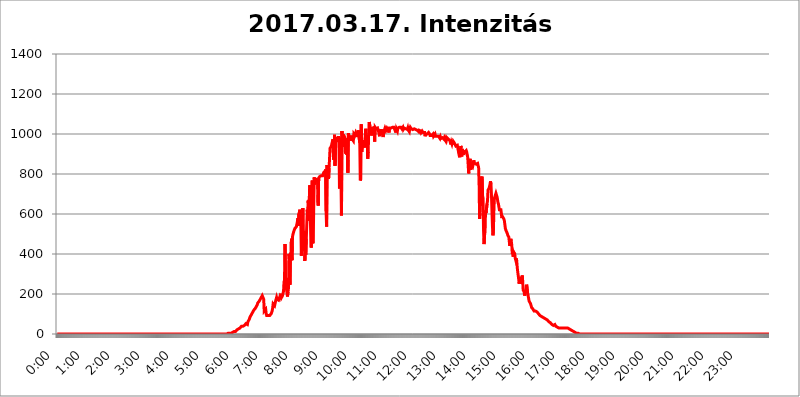
| Category | 2017.03.17. Intenzitás [W/m^2] |
|---|---|
| 0.0 | 0 |
| 0.0006944444444444445 | 0 |
| 0.001388888888888889 | 0 |
| 0.0020833333333333333 | 0 |
| 0.002777777777777778 | 0 |
| 0.003472222222222222 | 0 |
| 0.004166666666666667 | 0 |
| 0.004861111111111111 | 0 |
| 0.005555555555555556 | 0 |
| 0.0062499999999999995 | 0 |
| 0.006944444444444444 | 0 |
| 0.007638888888888889 | 0 |
| 0.008333333333333333 | 0 |
| 0.009027777777777779 | 0 |
| 0.009722222222222222 | 0 |
| 0.010416666666666666 | 0 |
| 0.011111111111111112 | 0 |
| 0.011805555555555555 | 0 |
| 0.012499999999999999 | 0 |
| 0.013194444444444444 | 0 |
| 0.013888888888888888 | 0 |
| 0.014583333333333332 | 0 |
| 0.015277777777777777 | 0 |
| 0.015972222222222224 | 0 |
| 0.016666666666666666 | 0 |
| 0.017361111111111112 | 0 |
| 0.018055555555555557 | 0 |
| 0.01875 | 0 |
| 0.019444444444444445 | 0 |
| 0.02013888888888889 | 0 |
| 0.020833333333333332 | 0 |
| 0.02152777777777778 | 0 |
| 0.022222222222222223 | 0 |
| 0.02291666666666667 | 0 |
| 0.02361111111111111 | 0 |
| 0.024305555555555556 | 0 |
| 0.024999999999999998 | 0 |
| 0.025694444444444447 | 0 |
| 0.02638888888888889 | 0 |
| 0.027083333333333334 | 0 |
| 0.027777777777777776 | 0 |
| 0.02847222222222222 | 0 |
| 0.029166666666666664 | 0 |
| 0.029861111111111113 | 0 |
| 0.030555555555555555 | 0 |
| 0.03125 | 0 |
| 0.03194444444444445 | 0 |
| 0.03263888888888889 | 0 |
| 0.03333333333333333 | 0 |
| 0.034027777777777775 | 0 |
| 0.034722222222222224 | 0 |
| 0.035416666666666666 | 0 |
| 0.036111111111111115 | 0 |
| 0.03680555555555556 | 0 |
| 0.0375 | 0 |
| 0.03819444444444444 | 0 |
| 0.03888888888888889 | 0 |
| 0.03958333333333333 | 0 |
| 0.04027777777777778 | 0 |
| 0.04097222222222222 | 0 |
| 0.041666666666666664 | 0 |
| 0.042361111111111106 | 0 |
| 0.04305555555555556 | 0 |
| 0.043750000000000004 | 0 |
| 0.044444444444444446 | 0 |
| 0.04513888888888889 | 0 |
| 0.04583333333333334 | 0 |
| 0.04652777777777778 | 0 |
| 0.04722222222222222 | 0 |
| 0.04791666666666666 | 0 |
| 0.04861111111111111 | 0 |
| 0.049305555555555554 | 0 |
| 0.049999999999999996 | 0 |
| 0.05069444444444445 | 0 |
| 0.051388888888888894 | 0 |
| 0.052083333333333336 | 0 |
| 0.05277777777777778 | 0 |
| 0.05347222222222222 | 0 |
| 0.05416666666666667 | 0 |
| 0.05486111111111111 | 0 |
| 0.05555555555555555 | 0 |
| 0.05625 | 0 |
| 0.05694444444444444 | 0 |
| 0.057638888888888885 | 0 |
| 0.05833333333333333 | 0 |
| 0.05902777777777778 | 0 |
| 0.059722222222222225 | 0 |
| 0.06041666666666667 | 0 |
| 0.061111111111111116 | 0 |
| 0.06180555555555556 | 0 |
| 0.0625 | 0 |
| 0.06319444444444444 | 0 |
| 0.06388888888888888 | 0 |
| 0.06458333333333334 | 0 |
| 0.06527777777777778 | 0 |
| 0.06597222222222222 | 0 |
| 0.06666666666666667 | 0 |
| 0.06736111111111111 | 0 |
| 0.06805555555555555 | 0 |
| 0.06874999999999999 | 0 |
| 0.06944444444444443 | 0 |
| 0.07013888888888889 | 0 |
| 0.07083333333333333 | 0 |
| 0.07152777777777779 | 0 |
| 0.07222222222222223 | 0 |
| 0.07291666666666667 | 0 |
| 0.07361111111111111 | 0 |
| 0.07430555555555556 | 0 |
| 0.075 | 0 |
| 0.07569444444444444 | 0 |
| 0.0763888888888889 | 0 |
| 0.07708333333333334 | 0 |
| 0.07777777777777778 | 0 |
| 0.07847222222222222 | 0 |
| 0.07916666666666666 | 0 |
| 0.0798611111111111 | 0 |
| 0.08055555555555556 | 0 |
| 0.08125 | 0 |
| 0.08194444444444444 | 0 |
| 0.08263888888888889 | 0 |
| 0.08333333333333333 | 0 |
| 0.08402777777777777 | 0 |
| 0.08472222222222221 | 0 |
| 0.08541666666666665 | 0 |
| 0.08611111111111112 | 0 |
| 0.08680555555555557 | 0 |
| 0.08750000000000001 | 0 |
| 0.08819444444444445 | 0 |
| 0.08888888888888889 | 0 |
| 0.08958333333333333 | 0 |
| 0.09027777777777778 | 0 |
| 0.09097222222222222 | 0 |
| 0.09166666666666667 | 0 |
| 0.09236111111111112 | 0 |
| 0.09305555555555556 | 0 |
| 0.09375 | 0 |
| 0.09444444444444444 | 0 |
| 0.09513888888888888 | 0 |
| 0.09583333333333333 | 0 |
| 0.09652777777777777 | 0 |
| 0.09722222222222222 | 0 |
| 0.09791666666666667 | 0 |
| 0.09861111111111111 | 0 |
| 0.09930555555555555 | 0 |
| 0.09999999999999999 | 0 |
| 0.10069444444444443 | 0 |
| 0.1013888888888889 | 0 |
| 0.10208333333333335 | 0 |
| 0.10277777777777779 | 0 |
| 0.10347222222222223 | 0 |
| 0.10416666666666667 | 0 |
| 0.10486111111111111 | 0 |
| 0.10555555555555556 | 0 |
| 0.10625 | 0 |
| 0.10694444444444444 | 0 |
| 0.1076388888888889 | 0 |
| 0.10833333333333334 | 0 |
| 0.10902777777777778 | 0 |
| 0.10972222222222222 | 0 |
| 0.1111111111111111 | 0 |
| 0.11180555555555556 | 0 |
| 0.11180555555555556 | 0 |
| 0.1125 | 0 |
| 0.11319444444444444 | 0 |
| 0.11388888888888889 | 0 |
| 0.11458333333333333 | 0 |
| 0.11527777777777777 | 0 |
| 0.11597222222222221 | 0 |
| 0.11666666666666665 | 0 |
| 0.1173611111111111 | 0 |
| 0.11805555555555557 | 0 |
| 0.11944444444444445 | 0 |
| 0.12013888888888889 | 0 |
| 0.12083333333333333 | 0 |
| 0.12152777777777778 | 0 |
| 0.12222222222222223 | 0 |
| 0.12291666666666667 | 0 |
| 0.12291666666666667 | 0 |
| 0.12361111111111112 | 0 |
| 0.12430555555555556 | 0 |
| 0.125 | 0 |
| 0.12569444444444444 | 0 |
| 0.12638888888888888 | 0 |
| 0.12708333333333333 | 0 |
| 0.16875 | 0 |
| 0.12847222222222224 | 0 |
| 0.12916666666666668 | 0 |
| 0.12986111111111112 | 0 |
| 0.13055555555555556 | 0 |
| 0.13125 | 0 |
| 0.13194444444444445 | 0 |
| 0.1326388888888889 | 0 |
| 0.13333333333333333 | 0 |
| 0.13402777777777777 | 0 |
| 0.13402777777777777 | 0 |
| 0.13472222222222222 | 0 |
| 0.13541666666666666 | 0 |
| 0.1361111111111111 | 0 |
| 0.13749999999999998 | 0 |
| 0.13819444444444443 | 0 |
| 0.1388888888888889 | 0 |
| 0.13958333333333334 | 0 |
| 0.14027777777777778 | 0 |
| 0.14097222222222222 | 0 |
| 0.14166666666666666 | 0 |
| 0.1423611111111111 | 0 |
| 0.14305555555555557 | 0 |
| 0.14375000000000002 | 0 |
| 0.14444444444444446 | 0 |
| 0.1451388888888889 | 0 |
| 0.1451388888888889 | 0 |
| 0.14652777777777778 | 0 |
| 0.14722222222222223 | 0 |
| 0.14791666666666667 | 0 |
| 0.1486111111111111 | 0 |
| 0.14930555555555555 | 0 |
| 0.15 | 0 |
| 0.15069444444444444 | 0 |
| 0.15138888888888888 | 0 |
| 0.15208333333333332 | 0 |
| 0.15277777777777776 | 0 |
| 0.15347222222222223 | 0 |
| 0.15416666666666667 | 0 |
| 0.15486111111111112 | 0 |
| 0.15555555555555556 | 0 |
| 0.15625 | 0 |
| 0.15694444444444444 | 0 |
| 0.15763888888888888 | 0 |
| 0.15833333333333333 | 0 |
| 0.15902777777777777 | 0 |
| 0.15972222222222224 | 0 |
| 0.16041666666666668 | 0 |
| 0.16111111111111112 | 0 |
| 0.16180555555555556 | 0 |
| 0.1625 | 0 |
| 0.16319444444444445 | 0 |
| 0.1638888888888889 | 0 |
| 0.16458333333333333 | 0 |
| 0.16527777777777777 | 0 |
| 0.16597222222222222 | 0 |
| 0.16666666666666666 | 0 |
| 0.1673611111111111 | 0 |
| 0.16805555555555554 | 0 |
| 0.16874999999999998 | 0 |
| 0.16944444444444443 | 0 |
| 0.17013888888888887 | 0 |
| 0.1708333333333333 | 0 |
| 0.17152777777777775 | 0 |
| 0.17222222222222225 | 0 |
| 0.1729166666666667 | 0 |
| 0.17361111111111113 | 0 |
| 0.17430555555555557 | 0 |
| 0.17500000000000002 | 0 |
| 0.17569444444444446 | 0 |
| 0.1763888888888889 | 0 |
| 0.17708333333333334 | 0 |
| 0.17777777777777778 | 0 |
| 0.17847222222222223 | 0 |
| 0.17916666666666667 | 0 |
| 0.1798611111111111 | 0 |
| 0.18055555555555555 | 0 |
| 0.18125 | 0 |
| 0.18194444444444444 | 0 |
| 0.1826388888888889 | 0 |
| 0.18333333333333335 | 0 |
| 0.1840277777777778 | 0 |
| 0.18472222222222223 | 0 |
| 0.18541666666666667 | 0 |
| 0.18611111111111112 | 0 |
| 0.18680555555555556 | 0 |
| 0.1875 | 0 |
| 0.18819444444444444 | 0 |
| 0.18888888888888888 | 0 |
| 0.18958333333333333 | 0 |
| 0.19027777777777777 | 0 |
| 0.1909722222222222 | 0 |
| 0.19166666666666665 | 0 |
| 0.19236111111111112 | 0 |
| 0.19305555555555554 | 0 |
| 0.19375 | 0 |
| 0.19444444444444445 | 0 |
| 0.1951388888888889 | 0 |
| 0.19583333333333333 | 0 |
| 0.19652777777777777 | 0 |
| 0.19722222222222222 | 0 |
| 0.19791666666666666 | 0 |
| 0.1986111111111111 | 0 |
| 0.19930555555555554 | 0 |
| 0.19999999999999998 | 0 |
| 0.20069444444444443 | 0 |
| 0.20138888888888887 | 0 |
| 0.2020833333333333 | 0 |
| 0.2027777777777778 | 0 |
| 0.2034722222222222 | 0 |
| 0.2041666666666667 | 0 |
| 0.20486111111111113 | 0 |
| 0.20555555555555557 | 0 |
| 0.20625000000000002 | 0 |
| 0.20694444444444446 | 0 |
| 0.2076388888888889 | 0 |
| 0.20833333333333334 | 0 |
| 0.20902777777777778 | 0 |
| 0.20972222222222223 | 0 |
| 0.21041666666666667 | 0 |
| 0.2111111111111111 | 0 |
| 0.21180555555555555 | 0 |
| 0.2125 | 0 |
| 0.21319444444444444 | 0 |
| 0.2138888888888889 | 0 |
| 0.21458333333333335 | 0 |
| 0.2152777777777778 | 0 |
| 0.21597222222222223 | 0 |
| 0.21666666666666667 | 0 |
| 0.21736111111111112 | 0 |
| 0.21805555555555556 | 0 |
| 0.21875 | 0 |
| 0.21944444444444444 | 0 |
| 0.22013888888888888 | 0 |
| 0.22083333333333333 | 0 |
| 0.22152777777777777 | 0 |
| 0.2222222222222222 | 0 |
| 0.22291666666666665 | 0 |
| 0.2236111111111111 | 0 |
| 0.22430555555555556 | 0 |
| 0.225 | 0 |
| 0.22569444444444445 | 0 |
| 0.2263888888888889 | 0 |
| 0.22708333333333333 | 0 |
| 0.22777777777777777 | 0 |
| 0.22847222222222222 | 0 |
| 0.22916666666666666 | 0 |
| 0.2298611111111111 | 0 |
| 0.23055555555555554 | 0 |
| 0.23124999999999998 | 0 |
| 0.23194444444444443 | 0 |
| 0.23263888888888887 | 0 |
| 0.2333333333333333 | 0 |
| 0.2340277777777778 | 0 |
| 0.2347222222222222 | 0 |
| 0.2354166666666667 | 0 |
| 0.23611111111111113 | 0 |
| 0.23680555555555557 | 0 |
| 0.23750000000000002 | 0 |
| 0.23819444444444446 | 0 |
| 0.2388888888888889 | 3.525 |
| 0.23958333333333334 | 3.525 |
| 0.24027777777777778 | 3.525 |
| 0.24097222222222223 | 3.525 |
| 0.24166666666666667 | 3.525 |
| 0.2423611111111111 | 3.525 |
| 0.24305555555555555 | 3.525 |
| 0.24375 | 3.525 |
| 0.24444444444444446 | 3.525 |
| 0.24513888888888888 | 7.887 |
| 0.24583333333333335 | 7.887 |
| 0.2465277777777778 | 7.887 |
| 0.24722222222222223 | 7.887 |
| 0.24791666666666667 | 12.257 |
| 0.24861111111111112 | 12.257 |
| 0.24930555555555556 | 12.257 |
| 0.25 | 12.257 |
| 0.25069444444444444 | 16.636 |
| 0.2513888888888889 | 16.636 |
| 0.2520833333333333 | 21.024 |
| 0.25277777777777777 | 21.024 |
| 0.2534722222222222 | 25.419 |
| 0.25416666666666665 | 25.419 |
| 0.2548611111111111 | 29.823 |
| 0.2555555555555556 | 29.823 |
| 0.25625000000000003 | 29.823 |
| 0.2569444444444445 | 34.234 |
| 0.2576388888888889 | 34.234 |
| 0.25833333333333336 | 38.653 |
| 0.2590277777777778 | 38.653 |
| 0.25972222222222224 | 38.653 |
| 0.2604166666666667 | 38.653 |
| 0.2611111111111111 | 38.653 |
| 0.26180555555555557 | 43.079 |
| 0.2625 | 43.079 |
| 0.26319444444444445 | 43.079 |
| 0.2638888888888889 | 47.511 |
| 0.26458333333333334 | 51.951 |
| 0.2652777777777778 | 47.511 |
| 0.2659722222222222 | 47.511 |
| 0.26666666666666666 | 47.511 |
| 0.2673611111111111 | 60.85 |
| 0.26805555555555555 | 65.31 |
| 0.26875 | 65.31 |
| 0.26944444444444443 | 74.246 |
| 0.2701388888888889 | 83.205 |
| 0.2708333333333333 | 87.692 |
| 0.27152777777777776 | 92.184 |
| 0.2722222222222222 | 96.682 |
| 0.27291666666666664 | 101.184 |
| 0.2736111111111111 | 105.69 |
| 0.2743055555555555 | 110.201 |
| 0.27499999999999997 | 114.716 |
| 0.27569444444444446 | 119.235 |
| 0.27638888888888885 | 123.758 |
| 0.27708333333333335 | 123.758 |
| 0.2777777777777778 | 128.284 |
| 0.27847222222222223 | 132.814 |
| 0.2791666666666667 | 137.347 |
| 0.2798611111111111 | 141.884 |
| 0.28055555555555556 | 146.423 |
| 0.28125 | 155.509 |
| 0.28194444444444444 | 155.509 |
| 0.2826388888888889 | 160.056 |
| 0.2833333333333333 | 164.605 |
| 0.28402777777777777 | 169.156 |
| 0.2847222222222222 | 173.709 |
| 0.28541666666666665 | 173.709 |
| 0.28611111111111115 | 182.82 |
| 0.28680555555555554 | 187.378 |
| 0.28750000000000003 | 191.937 |
| 0.2881944444444445 | 196.497 |
| 0.2888888888888889 | 196.497 |
| 0.28958333333333336 | 173.709 |
| 0.2902777777777778 | 114.716 |
| 0.29097222222222224 | 110.201 |
| 0.2916666666666667 | 110.201 |
| 0.2923611111111111 | 123.758 |
| 0.29305555555555557 | 101.184 |
| 0.29375 | 92.184 |
| 0.29444444444444445 | 92.184 |
| 0.2951388888888889 | 92.184 |
| 0.29583333333333334 | 92.184 |
| 0.2965277777777778 | 92.184 |
| 0.2972222222222222 | 92.184 |
| 0.29791666666666666 | 92.184 |
| 0.2986111111111111 | 92.184 |
| 0.29930555555555555 | 96.682 |
| 0.3 | 101.184 |
| 0.30069444444444443 | 105.69 |
| 0.3013888888888889 | 114.716 |
| 0.3020833333333333 | 128.284 |
| 0.30277777777777776 | 150.964 |
| 0.3034722222222222 | 150.964 |
| 0.30416666666666664 | 150.964 |
| 0.3048611111111111 | 141.884 |
| 0.3055555555555555 | 146.423 |
| 0.30624999999999997 | 164.605 |
| 0.3069444444444444 | 160.056 |
| 0.3076388888888889 | 182.82 |
| 0.30833333333333335 | 173.709 |
| 0.3090277777777778 | 173.709 |
| 0.30972222222222223 | 169.156 |
| 0.3104166666666667 | 169.156 |
| 0.3111111111111111 | 173.709 |
| 0.31180555555555556 | 182.82 |
| 0.3125 | 173.709 |
| 0.31319444444444444 | 173.709 |
| 0.3138888888888889 | 201.058 |
| 0.3145833333333333 | 182.82 |
| 0.31527777777777777 | 178.264 |
| 0.3159722222222222 | 191.937 |
| 0.31666666666666665 | 191.937 |
| 0.31736111111111115 | 214.746 |
| 0.31805555555555554 | 260.373 |
| 0.31875000000000003 | 269.49 |
| 0.3194444444444445 | 449.551 |
| 0.3201388888888889 | 287.709 |
| 0.32083333333333336 | 242.127 |
| 0.3215277777777778 | 246.689 |
| 0.32222222222222224 | 246.689 |
| 0.3229166666666667 | 187.378 |
| 0.3236111111111111 | 210.182 |
| 0.32430555555555557 | 228.436 |
| 0.325 | 400.638 |
| 0.32569444444444445 | 369.23 |
| 0.3263888888888889 | 246.689 |
| 0.32708333333333334 | 405.108 |
| 0.3277777777777778 | 373.729 |
| 0.3284722222222222 | 475.972 |
| 0.32916666666666666 | 369.23 |
| 0.3298611111111111 | 484.735 |
| 0.33055555555555555 | 497.836 |
| 0.33125 | 506.542 |
| 0.33194444444444443 | 515.223 |
| 0.3326388888888889 | 519.555 |
| 0.3333333333333333 | 528.2 |
| 0.3340277777777778 | 528.2 |
| 0.3347222222222222 | 523.88 |
| 0.3354166666666667 | 536.82 |
| 0.3361111111111111 | 549.704 |
| 0.3368055555555556 | 562.53 |
| 0.33749999999999997 | 579.542 |
| 0.33819444444444446 | 541.121 |
| 0.33888888888888885 | 600.661 |
| 0.33958333333333335 | 609.062 |
| 0.34027777777777773 | 621.613 |
| 0.34097222222222223 | 588.009 |
| 0.3416666666666666 | 553.986 |
| 0.3423611111111111 | 391.685 |
| 0.3430555555555555 | 471.582 |
| 0.34375 | 502.192 |
| 0.3444444444444445 | 629.948 |
| 0.3451388888888889 | 427.39 |
| 0.3458333333333334 | 515.223 |
| 0.34652777777777777 | 493.475 |
| 0.34722222222222227 | 364.728 |
| 0.34791666666666665 | 414.035 |
| 0.34861111111111115 | 396.164 |
| 0.34930555555555554 | 475.972 |
| 0.35000000000000003 | 549.704 |
| 0.3506944444444444 | 621.613 |
| 0.3513888888888889 | 566.793 |
| 0.3520833333333333 | 667.123 |
| 0.3527777777777778 | 604.864 |
| 0.3534722222222222 | 675.311 |
| 0.3541666666666667 | 743.859 |
| 0.3548611111111111 | 592.233 |
| 0.35555555555555557 | 497.836 |
| 0.35625 | 431.833 |
| 0.35694444444444445 | 675.311 |
| 0.3576388888888889 | 767.62 |
| 0.35833333333333334 | 453.968 |
| 0.3590277777777778 | 462.786 |
| 0.3597222222222222 | 638.256 |
| 0.36041666666666666 | 783.342 |
| 0.3611111111111111 | 747.834 |
| 0.36180555555555555 | 767.62 |
| 0.3625 | 779.42 |
| 0.36319444444444443 | 771.559 |
| 0.3638888888888889 | 759.723 |
| 0.3645833333333333 | 763.674 |
| 0.3652777777777778 | 775.492 |
| 0.3659722222222222 | 642.4 |
| 0.3666666666666667 | 779.42 |
| 0.3673611111111111 | 783.342 |
| 0.3680555555555556 | 787.258 |
| 0.36874999999999997 | 783.342 |
| 0.36944444444444446 | 787.258 |
| 0.37013888888888885 | 791.169 |
| 0.37083333333333335 | 795.074 |
| 0.37152777777777773 | 795.074 |
| 0.37222222222222223 | 791.169 |
| 0.3729166666666666 | 795.074 |
| 0.3736111111111111 | 806.757 |
| 0.3743055555555555 | 806.757 |
| 0.375 | 810.641 |
| 0.3756944444444445 | 814.519 |
| 0.3763888888888889 | 822.26 |
| 0.3770833333333334 | 613.252 |
| 0.37777777777777777 | 536.82 |
| 0.37847222222222227 | 845.365 |
| 0.37916666666666665 | 795.074 |
| 0.37986111111111115 | 841.526 |
| 0.38055555555555554 | 775.492 |
| 0.38125000000000003 | 829.981 |
| 0.3819444444444444 | 829.981 |
| 0.3826388888888889 | 928.819 |
| 0.3833333333333333 | 925.06 |
| 0.3840277777777778 | 936.33 |
| 0.3847222222222222 | 943.832 |
| 0.3854166666666667 | 955.071 |
| 0.3861111111111111 | 958.814 |
| 0.38680555555555557 | 973.772 |
| 0.3875 | 872.114 |
| 0.38819444444444445 | 906.223 |
| 0.3888888888888889 | 996.182 |
| 0.38958333333333334 | 841.526 |
| 0.3902777777777778 | 917.534 |
| 0.3909722222222222 | 977.508 |
| 0.39166666666666666 | 973.772 |
| 0.3923611111111111 | 973.772 |
| 0.39305555555555555 | 970.034 |
| 0.39375 | 981.244 |
| 0.39444444444444443 | 988.714 |
| 0.3951388888888889 | 970.034 |
| 0.3958333333333333 | 727.896 |
| 0.3965277777777778 | 898.668 |
| 0.3972222222222222 | 981.244 |
| 0.3979166666666667 | 783.342 |
| 0.3986111111111111 | 592.233 |
| 0.3993055555555556 | 1014.852 |
| 0.39999999999999997 | 973.772 |
| 0.40069444444444446 | 936.33 |
| 0.40138888888888885 | 996.182 |
| 0.40208333333333335 | 996.182 |
| 0.40277777777777773 | 996.182 |
| 0.40347222222222223 | 977.508 |
| 0.4041666666666666 | 902.447 |
| 0.4048611111111111 | 977.508 |
| 0.4055555555555555 | 958.814 |
| 0.40625 | 894.885 |
| 0.4069444444444445 | 925.06 |
| 0.4076388888888889 | 806.757 |
| 0.4083333333333334 | 1003.65 |
| 0.40902777777777777 | 988.714 |
| 0.40972222222222227 | 988.714 |
| 0.41041666666666665 | 981.244 |
| 0.41111111111111115 | 966.295 |
| 0.41180555555555554 | 977.508 |
| 0.41250000000000003 | 992.448 |
| 0.4131944444444444 | 977.508 |
| 0.4138888888888889 | 977.508 |
| 0.4145833333333333 | 977.508 |
| 0.4152777777777778 | 966.295 |
| 0.4159722222222222 | 999.916 |
| 0.4166666666666667 | 999.916 |
| 0.4173611111111111 | 992.448 |
| 0.41805555555555557 | 996.182 |
| 0.41875 | 1007.383 |
| 0.41944444444444445 | 1007.383 |
| 0.4201388888888889 | 996.182 |
| 0.42083333333333334 | 984.98 |
| 0.4215277777777778 | 996.182 |
| 0.4222222222222222 | 1018.587 |
| 0.42291666666666666 | 1018.587 |
| 0.4236111111111111 | 1022.323 |
| 0.42430555555555555 | 955.071 |
| 0.425 | 767.62 |
| 0.42569444444444443 | 775.492 |
| 0.4263888888888889 | 1048.508 |
| 0.4270833333333333 | 909.996 |
| 0.4277777777777778 | 962.555 |
| 0.4284722222222222 | 940.082 |
| 0.4291666666666667 | 940.082 |
| 0.4298611111111111 | 970.034 |
| 0.4305555555555556 | 932.576 |
| 0.43124999999999997 | 955.071 |
| 0.43194444444444446 | 988.714 |
| 0.43263888888888885 | 1026.06 |
| 0.43333333333333335 | 966.295 |
| 0.43402777777777773 | 962.555 |
| 0.43472222222222223 | 973.772 |
| 0.4354166666666666 | 875.918 |
| 0.4361111111111111 | 909.996 |
| 0.4368055555555555 | 1007.383 |
| 0.4375 | 1059.756 |
| 0.4381944444444445 | 1048.508 |
| 0.4388888888888889 | 1044.762 |
| 0.4395833333333334 | 1026.06 |
| 0.44027777777777777 | 992.448 |
| 0.44097222222222227 | 1007.383 |
| 0.44166666666666665 | 999.916 |
| 0.44236111111111115 | 1033.537 |
| 0.44305555555555554 | 1022.323 |
| 0.44375000000000003 | 1022.323 |
| 0.4444444444444444 | 1037.277 |
| 0.4451388888888889 | 962.555 |
| 0.4458333333333333 | 1033.537 |
| 0.4465277777777778 | 1029.798 |
| 0.4472222222222222 | 1026.06 |
| 0.4479166666666667 | 1029.798 |
| 0.4486111111111111 | 1026.06 |
| 0.44930555555555557 | 1029.798 |
| 0.45 | 1022.323 |
| 0.45069444444444445 | 1026.06 |
| 0.4513888888888889 | 999.916 |
| 0.45208333333333334 | 988.714 |
| 0.4527777777777778 | 1022.323 |
| 0.4534722222222222 | 1018.587 |
| 0.45416666666666666 | 1003.65 |
| 0.4548611111111111 | 1022.323 |
| 0.45555555555555555 | 1011.118 |
| 0.45625 | 1014.852 |
| 0.45694444444444443 | 984.98 |
| 0.4576388888888889 | 984.98 |
| 0.4583333333333333 | 1011.118 |
| 0.4590277777777778 | 1022.323 |
| 0.4597222222222222 | 1029.798 |
| 0.4604166666666667 | 1026.06 |
| 0.4611111111111111 | 1018.587 |
| 0.4618055555555556 | 1022.323 |
| 0.46249999999999997 | 1029.798 |
| 0.46319444444444446 | 1026.06 |
| 0.46388888888888885 | 1022.323 |
| 0.46458333333333335 | 1014.852 |
| 0.46527777777777773 | 1007.383 |
| 0.46597222222222223 | 1029.798 |
| 0.4666666666666666 | 1029.798 |
| 0.4673611111111111 | 1033.537 |
| 0.4680555555555555 | 1029.798 |
| 0.46875 | 1033.537 |
| 0.4694444444444445 | 1029.798 |
| 0.4701388888888889 | 1033.537 |
| 0.4708333333333334 | 1029.798 |
| 0.47152777777777777 | 1033.537 |
| 0.47222222222222227 | 1033.537 |
| 0.47291666666666665 | 1026.06 |
| 0.47361111111111115 | 1022.323 |
| 0.47430555555555554 | 1022.323 |
| 0.47500000000000003 | 1007.383 |
| 0.4756944444444444 | 1026.06 |
| 0.4763888888888889 | 1022.323 |
| 0.4770833333333333 | 1014.852 |
| 0.4777777777777778 | 1029.798 |
| 0.4784722222222222 | 1029.798 |
| 0.4791666666666667 | 1029.798 |
| 0.4798611111111111 | 1033.537 |
| 0.48055555555555557 | 1037.277 |
| 0.48125 | 1037.277 |
| 0.48194444444444445 | 1033.537 |
| 0.4826388888888889 | 1033.537 |
| 0.48333333333333334 | 1026.06 |
| 0.4840277777777778 | 1029.798 |
| 0.4847222222222222 | 1033.537 |
| 0.48541666666666666 | 1022.323 |
| 0.4861111111111111 | 1022.323 |
| 0.48680555555555555 | 1029.798 |
| 0.4875 | 1033.537 |
| 0.48819444444444443 | 1029.798 |
| 0.4888888888888889 | 1026.06 |
| 0.4895833333333333 | 1026.06 |
| 0.4902777777777778 | 1026.06 |
| 0.4909722222222222 | 1022.323 |
| 0.4916666666666667 | 1029.798 |
| 0.4923611111111111 | 1018.587 |
| 0.4930555555555556 | 1022.323 |
| 0.49374999999999997 | 1011.118 |
| 0.49444444444444446 | 1026.06 |
| 0.49513888888888885 | 1033.537 |
| 0.49583333333333335 | 1029.798 |
| 0.49652777777777773 | 1026.06 |
| 0.49722222222222223 | 1029.798 |
| 0.4979166666666666 | 1026.06 |
| 0.4986111111111111 | 1022.323 |
| 0.4993055555555555 | 1022.323 |
| 0.5 | 1018.587 |
| 0.5006944444444444 | 1026.06 |
| 0.5013888888888889 | 1022.323 |
| 0.5020833333333333 | 1022.323 |
| 0.5027777777777778 | 1022.323 |
| 0.5034722222222222 | 1022.323 |
| 0.5041666666666667 | 1018.587 |
| 0.5048611111111111 | 1018.587 |
| 0.5055555555555555 | 1014.852 |
| 0.50625 | 1022.323 |
| 0.5069444444444444 | 1011.118 |
| 0.5076388888888889 | 1018.587 |
| 0.5083333333333333 | 1014.852 |
| 0.5090277777777777 | 1014.852 |
| 0.5097222222222222 | 1014.852 |
| 0.5104166666666666 | 1007.383 |
| 0.5111111111111112 | 1011.118 |
| 0.5118055555555555 | 1014.852 |
| 0.5125000000000001 | 1011.118 |
| 0.5131944444444444 | 1007.383 |
| 0.513888888888889 | 1007.383 |
| 0.5145833333333333 | 1011.118 |
| 0.5152777777777778 | 1007.383 |
| 0.5159722222222222 | 988.714 |
| 0.5166666666666667 | 999.916 |
| 0.517361111111111 | 999.916 |
| 0.5180555555555556 | 999.916 |
| 0.5187499999999999 | 999.916 |
| 0.5194444444444445 | 996.182 |
| 0.5201388888888888 | 999.916 |
| 0.5208333333333334 | 1007.383 |
| 0.5215277777777778 | 1007.383 |
| 0.5222222222222223 | 999.916 |
| 0.5229166666666667 | 992.448 |
| 0.5236111111111111 | 992.448 |
| 0.5243055555555556 | 988.714 |
| 0.525 | 992.448 |
| 0.5256944444444445 | 992.448 |
| 0.5263888888888889 | 992.448 |
| 0.5270833333333333 | 999.916 |
| 0.5277777777777778 | 988.714 |
| 0.5284722222222222 | 988.714 |
| 0.5291666666666667 | 992.448 |
| 0.5298611111111111 | 999.916 |
| 0.5305555555555556 | 988.714 |
| 0.53125 | 988.714 |
| 0.5319444444444444 | 992.448 |
| 0.5326388888888889 | 988.714 |
| 0.5333333333333333 | 988.714 |
| 0.5340277777777778 | 992.448 |
| 0.5347222222222222 | 988.714 |
| 0.5354166666666667 | 988.714 |
| 0.5361111111111111 | 984.98 |
| 0.5368055555555555 | 977.508 |
| 0.5375 | 984.98 |
| 0.5381944444444444 | 977.508 |
| 0.5388888888888889 | 977.508 |
| 0.5395833333333333 | 973.772 |
| 0.5402777777777777 | 981.244 |
| 0.5409722222222222 | 977.508 |
| 0.5416666666666666 | 977.508 |
| 0.5423611111111112 | 973.772 |
| 0.5430555555555555 | 981.244 |
| 0.5437500000000001 | 977.508 |
| 0.5444444444444444 | 970.034 |
| 0.545138888888889 | 977.508 |
| 0.5458333333333333 | 970.034 |
| 0.5465277777777778 | 981.244 |
| 0.5472222222222222 | 981.244 |
| 0.5479166666666667 | 977.508 |
| 0.548611111111111 | 973.772 |
| 0.5493055555555556 | 970.034 |
| 0.5499999999999999 | 970.034 |
| 0.5506944444444445 | 966.295 |
| 0.5513888888888888 | 966.295 |
| 0.5520833333333334 | 947.58 |
| 0.5527777777777778 | 958.814 |
| 0.5534722222222223 | 951.327 |
| 0.5541666666666667 | 962.555 |
| 0.5548611111111111 | 947.58 |
| 0.5555555555555556 | 962.555 |
| 0.55625 | 962.555 |
| 0.5569444444444445 | 955.071 |
| 0.5576388888888889 | 958.814 |
| 0.5583333333333333 | 951.327 |
| 0.5590277777777778 | 940.082 |
| 0.5597222222222222 | 943.832 |
| 0.5604166666666667 | 936.33 |
| 0.5611111111111111 | 943.832 |
| 0.5618055555555556 | 947.58 |
| 0.5625 | 947.58 |
| 0.5631944444444444 | 902.447 |
| 0.5638888888888889 | 891.099 |
| 0.5645833333333333 | 883.516 |
| 0.5652777777777778 | 913.766 |
| 0.5659722222222222 | 940.082 |
| 0.5666666666666667 | 932.576 |
| 0.5673611111111111 | 887.309 |
| 0.5680555555555555 | 925.06 |
| 0.56875 | 909.996 |
| 0.5694444444444444 | 909.996 |
| 0.5701388888888889 | 894.885 |
| 0.5708333333333333 | 917.534 |
| 0.5715277777777777 | 909.996 |
| 0.5722222222222222 | 906.223 |
| 0.5729166666666666 | 909.996 |
| 0.5736111111111112 | 917.534 |
| 0.5743055555555555 | 909.996 |
| 0.5750000000000001 | 906.223 |
| 0.5756944444444444 | 883.516 |
| 0.576388888888889 | 887.309 |
| 0.5770833333333333 | 802.868 |
| 0.5777777777777778 | 849.199 |
| 0.5784722222222222 | 845.365 |
| 0.5791666666666667 | 875.918 |
| 0.579861111111111 | 822.26 |
| 0.5805555555555556 | 822.26 |
| 0.5812499999999999 | 845.365 |
| 0.5819444444444445 | 841.526 |
| 0.5826388888888888 | 837.682 |
| 0.5833333333333334 | 849.199 |
| 0.5840277777777778 | 868.305 |
| 0.5847222222222223 | 860.676 |
| 0.5854166666666667 | 853.029 |
| 0.5861111111111111 | 856.855 |
| 0.5868055555555556 | 856.855 |
| 0.5875 | 849.199 |
| 0.5881944444444445 | 845.365 |
| 0.5888888888888889 | 853.029 |
| 0.5895833333333333 | 853.029 |
| 0.5902777777777778 | 841.526 |
| 0.5909722222222222 | 833.834 |
| 0.5916666666666667 | 751.803 |
| 0.5923611111111111 | 575.299 |
| 0.5930555555555556 | 604.864 |
| 0.59375 | 667.123 |
| 0.5944444444444444 | 775.492 |
| 0.5951388888888889 | 775.492 |
| 0.5958333333333333 | 787.258 |
| 0.5965277777777778 | 691.608 |
| 0.5972222222222222 | 679.395 |
| 0.5979166666666667 | 515.223 |
| 0.5986111111111111 | 449.551 |
| 0.5993055555555555 | 493.475 |
| 0.6 | 510.885 |
| 0.6006944444444444 | 617.436 |
| 0.6013888888888889 | 604.864 |
| 0.6020833333333333 | 604.864 |
| 0.6027777777777777 | 650.667 |
| 0.6034722222222222 | 667.123 |
| 0.6041666666666666 | 719.877 |
| 0.6048611111111112 | 723.889 |
| 0.6055555555555555 | 727.896 |
| 0.6062500000000001 | 727.896 |
| 0.6069444444444444 | 747.834 |
| 0.607638888888889 | 763.674 |
| 0.6083333333333333 | 747.834 |
| 0.6090277777777778 | 691.608 |
| 0.6097222222222222 | 613.252 |
| 0.6104166666666667 | 536.82 |
| 0.611111111111111 | 493.475 |
| 0.6118055555555556 | 523.88 |
| 0.6124999999999999 | 634.105 |
| 0.6131944444444445 | 679.395 |
| 0.6138888888888888 | 683.473 |
| 0.6145833333333334 | 695.666 |
| 0.6152777777777778 | 703.762 |
| 0.6159722222222223 | 695.666 |
| 0.6166666666666667 | 687.544 |
| 0.6173611111111111 | 675.311 |
| 0.6180555555555556 | 658.909 |
| 0.61875 | 650.667 |
| 0.6194444444444445 | 650.667 |
| 0.6201388888888889 | 621.613 |
| 0.6208333333333333 | 621.613 |
| 0.6215277777777778 | 625.784 |
| 0.6222222222222222 | 621.613 |
| 0.6229166666666667 | 600.661 |
| 0.6236111111111111 | 579.542 |
| 0.6243055555555556 | 588.009 |
| 0.625 | 592.233 |
| 0.6256944444444444 | 583.779 |
| 0.6263888888888889 | 575.299 |
| 0.6270833333333333 | 566.793 |
| 0.6277777777777778 | 562.53 |
| 0.6284722222222222 | 528.2 |
| 0.6291666666666667 | 519.555 |
| 0.6298611111111111 | 523.88 |
| 0.6305555555555555 | 523.88 |
| 0.63125 | 502.192 |
| 0.6319444444444444 | 493.475 |
| 0.6326388888888889 | 493.475 |
| 0.6333333333333333 | 484.735 |
| 0.6340277777777777 | 484.735 |
| 0.6347222222222222 | 440.702 |
| 0.6354166666666666 | 467.187 |
| 0.6361111111111112 | 475.972 |
| 0.6368055555555555 | 462.786 |
| 0.6375000000000001 | 445.129 |
| 0.6381944444444444 | 400.638 |
| 0.638888888888889 | 409.574 |
| 0.6395833333333333 | 387.202 |
| 0.6402777777777778 | 409.574 |
| 0.6409722222222222 | 414.035 |
| 0.6416666666666667 | 400.638 |
| 0.642361111111111 | 378.224 |
| 0.6430555555555556 | 369.23 |
| 0.6437499999999999 | 378.224 |
| 0.6444444444444445 | 364.728 |
| 0.6451388888888888 | 333.113 |
| 0.6458333333333334 | 310.44 |
| 0.6465277777777778 | 292.259 |
| 0.6472222222222223 | 274.047 |
| 0.6479166666666667 | 251.251 |
| 0.6486111111111111 | 278.603 |
| 0.6493055555555556 | 260.373 |
| 0.65 | 264.932 |
| 0.6506944444444445 | 283.156 |
| 0.6513888888888889 | 251.251 |
| 0.6520833333333333 | 292.259 |
| 0.6527777777777778 | 264.932 |
| 0.6534722222222222 | 219.309 |
| 0.6541666666666667 | 214.746 |
| 0.6548611111111111 | 210.182 |
| 0.6555555555555556 | 191.937 |
| 0.65625 | 205.62 |
| 0.6569444444444444 | 214.746 |
| 0.6576388888888889 | 219.309 |
| 0.6583333333333333 | 246.689 |
| 0.6590277777777778 | 251.251 |
| 0.6597222222222222 | 205.62 |
| 0.6604166666666667 | 201.058 |
| 0.6611111111111111 | 178.264 |
| 0.6618055555555555 | 164.605 |
| 0.6625 | 164.605 |
| 0.6631944444444444 | 160.056 |
| 0.6638888888888889 | 150.964 |
| 0.6645833333333333 | 141.884 |
| 0.6652777777777777 | 132.814 |
| 0.6659722222222222 | 132.814 |
| 0.6666666666666666 | 128.284 |
| 0.6673611111111111 | 123.758 |
| 0.6680555555555556 | 119.235 |
| 0.6687500000000001 | 114.716 |
| 0.6694444444444444 | 114.716 |
| 0.6701388888888888 | 114.716 |
| 0.6708333333333334 | 114.716 |
| 0.6715277777777778 | 114.716 |
| 0.6722222222222222 | 110.201 |
| 0.6729166666666666 | 110.201 |
| 0.6736111111111112 | 105.69 |
| 0.6743055555555556 | 105.69 |
| 0.6749999999999999 | 101.184 |
| 0.6756944444444444 | 101.184 |
| 0.6763888888888889 | 96.682 |
| 0.6770833333333334 | 92.184 |
| 0.6777777777777777 | 92.184 |
| 0.6784722222222223 | 87.692 |
| 0.6791666666666667 | 87.692 |
| 0.6798611111111111 | 83.205 |
| 0.6805555555555555 | 83.205 |
| 0.68125 | 83.205 |
| 0.6819444444444445 | 83.205 |
| 0.6826388888888889 | 78.722 |
| 0.6833333333333332 | 78.722 |
| 0.6840277777777778 | 74.246 |
| 0.6847222222222222 | 74.246 |
| 0.6854166666666667 | 74.246 |
| 0.686111111111111 | 69.775 |
| 0.6868055555555556 | 69.775 |
| 0.6875 | 69.775 |
| 0.6881944444444444 | 65.31 |
| 0.688888888888889 | 65.31 |
| 0.6895833333333333 | 60.85 |
| 0.6902777777777778 | 60.85 |
| 0.6909722222222222 | 56.398 |
| 0.6916666666666668 | 56.398 |
| 0.6923611111111111 | 51.951 |
| 0.6930555555555555 | 51.951 |
| 0.69375 | 47.511 |
| 0.6944444444444445 | 47.511 |
| 0.6951388888888889 | 43.079 |
| 0.6958333333333333 | 43.079 |
| 0.6965277777777777 | 43.079 |
| 0.6972222222222223 | 47.511 |
| 0.6979166666666666 | 47.511 |
| 0.6986111111111111 | 43.079 |
| 0.6993055555555556 | 38.653 |
| 0.7000000000000001 | 34.234 |
| 0.7006944444444444 | 34.234 |
| 0.7013888888888888 | 34.234 |
| 0.7020833333333334 | 29.823 |
| 0.7027777777777778 | 29.823 |
| 0.7034722222222222 | 29.823 |
| 0.7041666666666666 | 29.823 |
| 0.7048611111111112 | 29.823 |
| 0.7055555555555556 | 29.823 |
| 0.7062499999999999 | 29.823 |
| 0.7069444444444444 | 29.823 |
| 0.7076388888888889 | 29.823 |
| 0.7083333333333334 | 29.823 |
| 0.7090277777777777 | 29.823 |
| 0.7097222222222223 | 29.823 |
| 0.7104166666666667 | 29.823 |
| 0.7111111111111111 | 29.823 |
| 0.7118055555555555 | 29.823 |
| 0.7125 | 29.823 |
| 0.7131944444444445 | 29.823 |
| 0.7138888888888889 | 29.823 |
| 0.7145833333333332 | 29.823 |
| 0.7152777777777778 | 29.823 |
| 0.7159722222222222 | 29.823 |
| 0.7166666666666667 | 29.823 |
| 0.717361111111111 | 25.419 |
| 0.7180555555555556 | 25.419 |
| 0.71875 | 25.419 |
| 0.7194444444444444 | 21.024 |
| 0.720138888888889 | 21.024 |
| 0.7208333333333333 | 21.024 |
| 0.7215277777777778 | 16.636 |
| 0.7222222222222222 | 16.636 |
| 0.7229166666666668 | 16.636 |
| 0.7236111111111111 | 12.257 |
| 0.7243055555555555 | 12.257 |
| 0.725 | 12.257 |
| 0.7256944444444445 | 7.887 |
| 0.7263888888888889 | 7.887 |
| 0.7270833333333333 | 7.887 |
| 0.7277777777777777 | 7.887 |
| 0.7284722222222223 | 3.525 |
| 0.7291666666666666 | 3.525 |
| 0.7298611111111111 | 3.525 |
| 0.7305555555555556 | 3.525 |
| 0.7312500000000001 | 3.525 |
| 0.7319444444444444 | 3.525 |
| 0.7326388888888888 | 0 |
| 0.7333333333333334 | 0 |
| 0.7340277777777778 | 0 |
| 0.7347222222222222 | 0 |
| 0.7354166666666666 | 0 |
| 0.7361111111111112 | 0 |
| 0.7368055555555556 | 0 |
| 0.7374999999999999 | 0 |
| 0.7381944444444444 | 0 |
| 0.7388888888888889 | 0 |
| 0.7395833333333334 | 0 |
| 0.7402777777777777 | 0 |
| 0.7409722222222223 | 0 |
| 0.7416666666666667 | 0 |
| 0.7423611111111111 | 0 |
| 0.7430555555555555 | 0 |
| 0.74375 | 0 |
| 0.7444444444444445 | 0 |
| 0.7451388888888889 | 0 |
| 0.7458333333333332 | 0 |
| 0.7465277777777778 | 0 |
| 0.7472222222222222 | 0 |
| 0.7479166666666667 | 0 |
| 0.748611111111111 | 0 |
| 0.7493055555555556 | 0 |
| 0.75 | 0 |
| 0.7506944444444444 | 0 |
| 0.751388888888889 | 0 |
| 0.7520833333333333 | 0 |
| 0.7527777777777778 | 0 |
| 0.7534722222222222 | 0 |
| 0.7541666666666668 | 0 |
| 0.7548611111111111 | 0 |
| 0.7555555555555555 | 0 |
| 0.75625 | 0 |
| 0.7569444444444445 | 0 |
| 0.7576388888888889 | 0 |
| 0.7583333333333333 | 0 |
| 0.7590277777777777 | 0 |
| 0.7597222222222223 | 0 |
| 0.7604166666666666 | 0 |
| 0.7611111111111111 | 0 |
| 0.7618055555555556 | 0 |
| 0.7625000000000001 | 0 |
| 0.7631944444444444 | 0 |
| 0.7638888888888888 | 0 |
| 0.7645833333333334 | 0 |
| 0.7652777777777778 | 0 |
| 0.7659722222222222 | 0 |
| 0.7666666666666666 | 0 |
| 0.7673611111111112 | 0 |
| 0.7680555555555556 | 0 |
| 0.7687499999999999 | 0 |
| 0.7694444444444444 | 0 |
| 0.7701388888888889 | 0 |
| 0.7708333333333334 | 0 |
| 0.7715277777777777 | 0 |
| 0.7722222222222223 | 0 |
| 0.7729166666666667 | 0 |
| 0.7736111111111111 | 0 |
| 0.7743055555555555 | 0 |
| 0.775 | 0 |
| 0.7756944444444445 | 0 |
| 0.7763888888888889 | 0 |
| 0.7770833333333332 | 0 |
| 0.7777777777777778 | 0 |
| 0.7784722222222222 | 0 |
| 0.7791666666666667 | 0 |
| 0.779861111111111 | 0 |
| 0.7805555555555556 | 0 |
| 0.78125 | 0 |
| 0.7819444444444444 | 0 |
| 0.782638888888889 | 0 |
| 0.7833333333333333 | 0 |
| 0.7840277777777778 | 0 |
| 0.7847222222222222 | 0 |
| 0.7854166666666668 | 0 |
| 0.7861111111111111 | 0 |
| 0.7868055555555555 | 0 |
| 0.7875 | 0 |
| 0.7881944444444445 | 0 |
| 0.7888888888888889 | 0 |
| 0.7895833333333333 | 0 |
| 0.7902777777777777 | 0 |
| 0.7909722222222223 | 0 |
| 0.7916666666666666 | 0 |
| 0.7923611111111111 | 0 |
| 0.7930555555555556 | 0 |
| 0.7937500000000001 | 0 |
| 0.7944444444444444 | 0 |
| 0.7951388888888888 | 0 |
| 0.7958333333333334 | 0 |
| 0.7965277777777778 | 0 |
| 0.7972222222222222 | 0 |
| 0.7979166666666666 | 0 |
| 0.7986111111111112 | 0 |
| 0.7993055555555556 | 0 |
| 0.7999999999999999 | 0 |
| 0.8006944444444444 | 0 |
| 0.8013888888888889 | 0 |
| 0.8020833333333334 | 0 |
| 0.8027777777777777 | 0 |
| 0.8034722222222223 | 0 |
| 0.8041666666666667 | 0 |
| 0.8048611111111111 | 0 |
| 0.8055555555555555 | 0 |
| 0.80625 | 0 |
| 0.8069444444444445 | 0 |
| 0.8076388888888889 | 0 |
| 0.8083333333333332 | 0 |
| 0.8090277777777778 | 0 |
| 0.8097222222222222 | 0 |
| 0.8104166666666667 | 0 |
| 0.811111111111111 | 0 |
| 0.8118055555555556 | 0 |
| 0.8125 | 0 |
| 0.8131944444444444 | 0 |
| 0.813888888888889 | 0 |
| 0.8145833333333333 | 0 |
| 0.8152777777777778 | 0 |
| 0.8159722222222222 | 0 |
| 0.8166666666666668 | 0 |
| 0.8173611111111111 | 0 |
| 0.8180555555555555 | 0 |
| 0.81875 | 0 |
| 0.8194444444444445 | 0 |
| 0.8201388888888889 | 0 |
| 0.8208333333333333 | 0 |
| 0.8215277777777777 | 0 |
| 0.8222222222222223 | 0 |
| 0.8229166666666666 | 0 |
| 0.8236111111111111 | 0 |
| 0.8243055555555556 | 0 |
| 0.8250000000000001 | 0 |
| 0.8256944444444444 | 0 |
| 0.8263888888888888 | 0 |
| 0.8270833333333334 | 0 |
| 0.8277777777777778 | 0 |
| 0.8284722222222222 | 0 |
| 0.8291666666666666 | 0 |
| 0.8298611111111112 | 0 |
| 0.8305555555555556 | 0 |
| 0.8312499999999999 | 0 |
| 0.8319444444444444 | 0 |
| 0.8326388888888889 | 0 |
| 0.8333333333333334 | 0 |
| 0.8340277777777777 | 0 |
| 0.8347222222222223 | 0 |
| 0.8354166666666667 | 0 |
| 0.8361111111111111 | 0 |
| 0.8368055555555555 | 0 |
| 0.8375 | 0 |
| 0.8381944444444445 | 0 |
| 0.8388888888888889 | 0 |
| 0.8395833333333332 | 0 |
| 0.8402777777777778 | 0 |
| 0.8409722222222222 | 0 |
| 0.8416666666666667 | 0 |
| 0.842361111111111 | 0 |
| 0.8430555555555556 | 0 |
| 0.84375 | 0 |
| 0.8444444444444444 | 0 |
| 0.845138888888889 | 0 |
| 0.8458333333333333 | 0 |
| 0.8465277777777778 | 0 |
| 0.8472222222222222 | 0 |
| 0.8479166666666668 | 0 |
| 0.8486111111111111 | 0 |
| 0.8493055555555555 | 0 |
| 0.85 | 0 |
| 0.8506944444444445 | 0 |
| 0.8513888888888889 | 0 |
| 0.8520833333333333 | 0 |
| 0.8527777777777777 | 0 |
| 0.8534722222222223 | 0 |
| 0.8541666666666666 | 0 |
| 0.8548611111111111 | 0 |
| 0.8555555555555556 | 0 |
| 0.8562500000000001 | 0 |
| 0.8569444444444444 | 0 |
| 0.8576388888888888 | 0 |
| 0.8583333333333334 | 0 |
| 0.8590277777777778 | 0 |
| 0.8597222222222222 | 0 |
| 0.8604166666666666 | 0 |
| 0.8611111111111112 | 0 |
| 0.8618055555555556 | 0 |
| 0.8624999999999999 | 0 |
| 0.8631944444444444 | 0 |
| 0.8638888888888889 | 0 |
| 0.8645833333333334 | 0 |
| 0.8652777777777777 | 0 |
| 0.8659722222222223 | 0 |
| 0.8666666666666667 | 0 |
| 0.8673611111111111 | 0 |
| 0.8680555555555555 | 0 |
| 0.86875 | 0 |
| 0.8694444444444445 | 0 |
| 0.8701388888888889 | 0 |
| 0.8708333333333332 | 0 |
| 0.8715277777777778 | 0 |
| 0.8722222222222222 | 0 |
| 0.8729166666666667 | 0 |
| 0.873611111111111 | 0 |
| 0.8743055555555556 | 0 |
| 0.875 | 0 |
| 0.8756944444444444 | 0 |
| 0.876388888888889 | 0 |
| 0.8770833333333333 | 0 |
| 0.8777777777777778 | 0 |
| 0.8784722222222222 | 0 |
| 0.8791666666666668 | 0 |
| 0.8798611111111111 | 0 |
| 0.8805555555555555 | 0 |
| 0.88125 | 0 |
| 0.8819444444444445 | 0 |
| 0.8826388888888889 | 0 |
| 0.8833333333333333 | 0 |
| 0.8840277777777777 | 0 |
| 0.8847222222222223 | 0 |
| 0.8854166666666666 | 0 |
| 0.8861111111111111 | 0 |
| 0.8868055555555556 | 0 |
| 0.8875000000000001 | 0 |
| 0.8881944444444444 | 0 |
| 0.8888888888888888 | 0 |
| 0.8895833333333334 | 0 |
| 0.8902777777777778 | 0 |
| 0.8909722222222222 | 0 |
| 0.8916666666666666 | 0 |
| 0.8923611111111112 | 0 |
| 0.8930555555555556 | 0 |
| 0.8937499999999999 | 0 |
| 0.8944444444444444 | 0 |
| 0.8951388888888889 | 0 |
| 0.8958333333333334 | 0 |
| 0.8965277777777777 | 0 |
| 0.8972222222222223 | 0 |
| 0.8979166666666667 | 0 |
| 0.8986111111111111 | 0 |
| 0.8993055555555555 | 0 |
| 0.9 | 0 |
| 0.9006944444444445 | 0 |
| 0.9013888888888889 | 0 |
| 0.9020833333333332 | 0 |
| 0.9027777777777778 | 0 |
| 0.9034722222222222 | 0 |
| 0.9041666666666667 | 0 |
| 0.904861111111111 | 0 |
| 0.9055555555555556 | 0 |
| 0.90625 | 0 |
| 0.9069444444444444 | 0 |
| 0.907638888888889 | 0 |
| 0.9083333333333333 | 0 |
| 0.9090277777777778 | 0 |
| 0.9097222222222222 | 0 |
| 0.9104166666666668 | 0 |
| 0.9111111111111111 | 0 |
| 0.9118055555555555 | 0 |
| 0.9125 | 0 |
| 0.9131944444444445 | 0 |
| 0.9138888888888889 | 0 |
| 0.9145833333333333 | 0 |
| 0.9152777777777777 | 0 |
| 0.9159722222222223 | 0 |
| 0.9166666666666666 | 0 |
| 0.9173611111111111 | 0 |
| 0.9180555555555556 | 0 |
| 0.9187500000000001 | 0 |
| 0.9194444444444444 | 0 |
| 0.9201388888888888 | 0 |
| 0.9208333333333334 | 0 |
| 0.9215277777777778 | 0 |
| 0.9222222222222222 | 0 |
| 0.9229166666666666 | 0 |
| 0.9236111111111112 | 0 |
| 0.9243055555555556 | 0 |
| 0.9249999999999999 | 0 |
| 0.9256944444444444 | 0 |
| 0.9263888888888889 | 0 |
| 0.9270833333333334 | 0 |
| 0.9277777777777777 | 0 |
| 0.9284722222222223 | 0 |
| 0.9291666666666667 | 0 |
| 0.9298611111111111 | 0 |
| 0.9305555555555555 | 0 |
| 0.93125 | 0 |
| 0.9319444444444445 | 0 |
| 0.9326388888888889 | 0 |
| 0.9333333333333332 | 0 |
| 0.9340277777777778 | 0 |
| 0.9347222222222222 | 0 |
| 0.9354166666666667 | 0 |
| 0.936111111111111 | 0 |
| 0.9368055555555556 | 0 |
| 0.9375 | 0 |
| 0.9381944444444444 | 0 |
| 0.938888888888889 | 0 |
| 0.9395833333333333 | 0 |
| 0.9402777777777778 | 0 |
| 0.9409722222222222 | 0 |
| 0.9416666666666668 | 0 |
| 0.9423611111111111 | 0 |
| 0.9430555555555555 | 0 |
| 0.94375 | 0 |
| 0.9444444444444445 | 0 |
| 0.9451388888888889 | 0 |
| 0.9458333333333333 | 0 |
| 0.9465277777777777 | 0 |
| 0.9472222222222223 | 0 |
| 0.9479166666666666 | 0 |
| 0.9486111111111111 | 0 |
| 0.9493055555555556 | 0 |
| 0.9500000000000001 | 0 |
| 0.9506944444444444 | 0 |
| 0.9513888888888888 | 0 |
| 0.9520833333333334 | 0 |
| 0.9527777777777778 | 0 |
| 0.9534722222222222 | 0 |
| 0.9541666666666666 | 0 |
| 0.9548611111111112 | 0 |
| 0.9555555555555556 | 0 |
| 0.9562499999999999 | 0 |
| 0.9569444444444444 | 0 |
| 0.9576388888888889 | 0 |
| 0.9583333333333334 | 0 |
| 0.9590277777777777 | 0 |
| 0.9597222222222223 | 0 |
| 0.9604166666666667 | 0 |
| 0.9611111111111111 | 0 |
| 0.9618055555555555 | 0 |
| 0.9625 | 0 |
| 0.9631944444444445 | 0 |
| 0.9638888888888889 | 0 |
| 0.9645833333333332 | 0 |
| 0.9652777777777778 | 0 |
| 0.9659722222222222 | 0 |
| 0.9666666666666667 | 0 |
| 0.967361111111111 | 0 |
| 0.9680555555555556 | 0 |
| 0.96875 | 0 |
| 0.9694444444444444 | 0 |
| 0.970138888888889 | 0 |
| 0.9708333333333333 | 0 |
| 0.9715277777777778 | 0 |
| 0.9722222222222222 | 0 |
| 0.9729166666666668 | 0 |
| 0.9736111111111111 | 0 |
| 0.9743055555555555 | 0 |
| 0.975 | 0 |
| 0.9756944444444445 | 0 |
| 0.9763888888888889 | 0 |
| 0.9770833333333333 | 0 |
| 0.9777777777777777 | 0 |
| 0.9784722222222223 | 0 |
| 0.9791666666666666 | 0 |
| 0.9798611111111111 | 0 |
| 0.9805555555555556 | 0 |
| 0.9812500000000001 | 0 |
| 0.9819444444444444 | 0 |
| 0.9826388888888888 | 0 |
| 0.9833333333333334 | 0 |
| 0.9840277777777778 | 0 |
| 0.9847222222222222 | 0 |
| 0.9854166666666666 | 0 |
| 0.9861111111111112 | 0 |
| 0.9868055555555556 | 0 |
| 0.9874999999999999 | 0 |
| 0.9881944444444444 | 0 |
| 0.9888888888888889 | 0 |
| 0.9895833333333334 | 0 |
| 0.9902777777777777 | 0 |
| 0.9909722222222223 | 0 |
| 0.9916666666666667 | 0 |
| 0.9923611111111111 | 0 |
| 0.9930555555555555 | 0 |
| 0.99375 | 0 |
| 0.9944444444444445 | 0 |
| 0.9951388888888889 | 0 |
| 0.9958333333333332 | 0 |
| 0.9965277777777778 | 0 |
| 0.9972222222222222 | 0 |
| 0.9979166666666667 | 0 |
| 0.998611111111111 | 0 |
| 0.9993055555555556 | 0 |